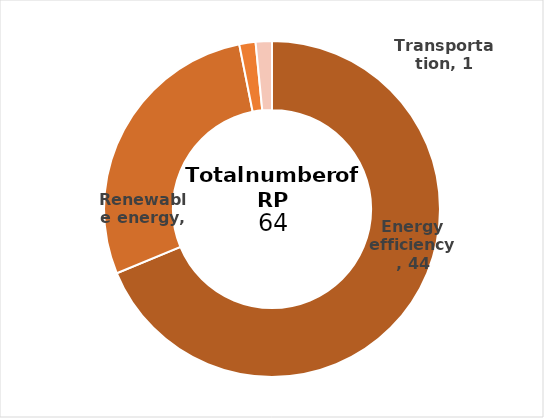
| Category | Series 0 |
|---|---|
| 0 | 44 |
| 1 | 18 |
| 2 | 1 |
| 3 | 1 |